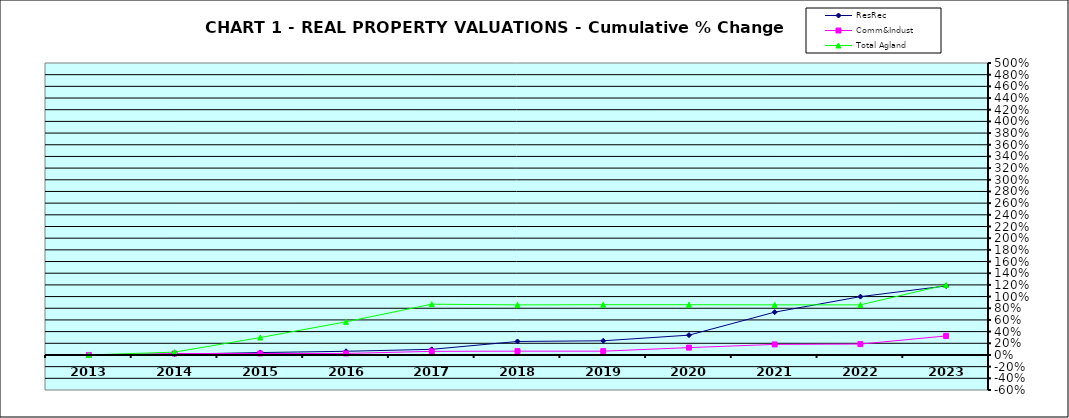
| Category | ResRec | Comm&Indust | Total Agland |
|---|---|---|---|
| 2013.0 | 0 | 0 | 0 |
| 2014.0 | 0.012 | 0.025 | 0.048 |
| 2015.0 | 0.041 | 0.025 | 0.298 |
| 2016.0 | 0.063 | 0.026 | 0.567 |
| 2017.0 | 0.096 | 0.062 | 0.87 |
| 2018.0 | 0.231 | 0.065 | 0.858 |
| 2019.0 | 0.243 | 0.065 | 0.861 |
| 2020.0 | 0.339 | 0.126 | 0.861 |
| 2021.0 | 0.733 | 0.181 | 0.858 |
| 2022.0 | 0.999 | 0.186 | 0.858 |
| 2023.0 | 1.182 | 0.326 | 1.199 |